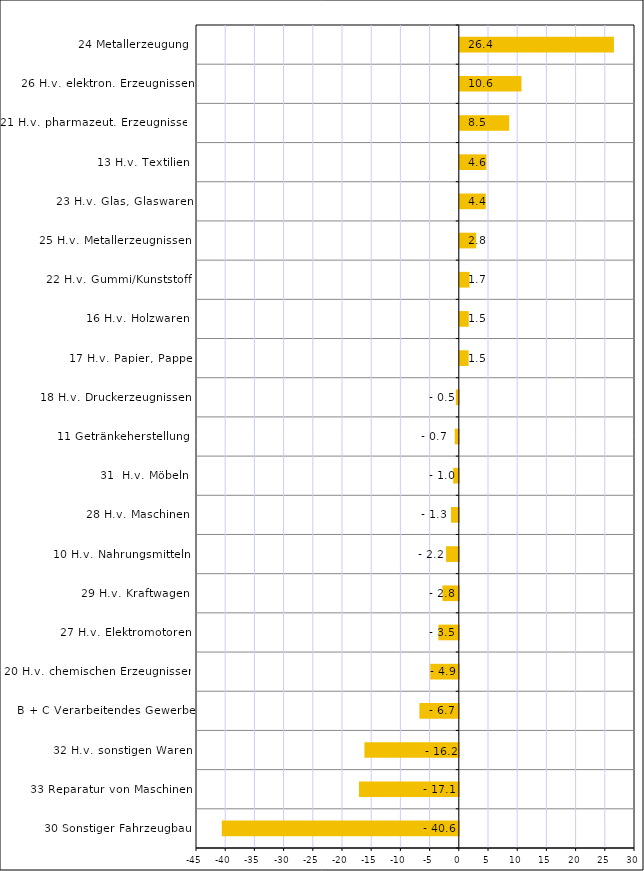
| Category | Series 0 |
|---|---|
| 30 Sonstiger Fahrzeugbau | -40.58 |
| 33 Reparatur von Maschinen | -17.088 |
| 32 H.v. sonstigen Waren | -16.158 |
| B + C Verarbeitendes Gewerbe | -6.743 |
| 20 H.v. chemischen Erzeugnissen | -4.89 |
| 27 H.v. Elektromotoren | -3.492 |
| 29 H.v. Kraftwagen | -2.805 |
| 10 H.v. Nahrungsmitteln | -2.184 |
| 28 H.v. Maschinen | -1.33 |
| 31  H.v. Möbeln | -0.952 |
| 11 Getränkeherstellung | -0.695 |
| 18 H.v. Druckerzeugnissen | -0.506 |
| 17 H.v. Papier, Pappe | 1.507 |
| 16 H.v. Holzwaren | 1.532 |
| 22 H.v. Gummi/Kunststoff | 1.669 |
| 25 H.v. Metallerzeugnissen | 2.808 |
| 23 H.v. Glas, Glaswaren | 4.444 |
| 13 H.v. Textilien | 4.564 |
| 21 H.v. pharmazeut. Erzeugnissen | 8.46 |
| 26 H.v. elektron. Erzeugnissen | 10.56 |
| 24 Metallerzeugung | 26.39 |